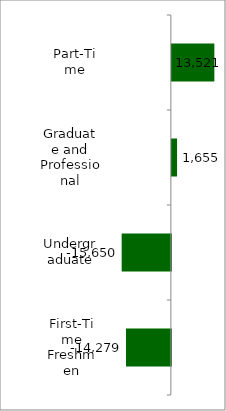
| Category | 50 states and D.C. |
|---|---|
| First-Time Freshmen | -14279 |
| Undergraduate | -15650 |
| Graduate and Professional | 1655 |
| Part-Time | 13521 |